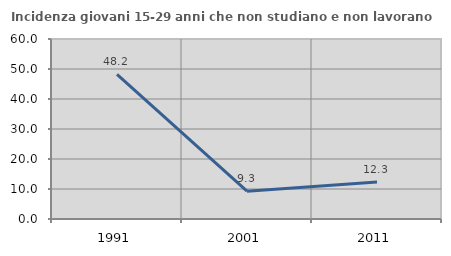
| Category | Incidenza giovani 15-29 anni che non studiano e non lavorano  |
|---|---|
| 1991.0 | 48.212 |
| 2001.0 | 9.265 |
| 2011.0 | 12.346 |